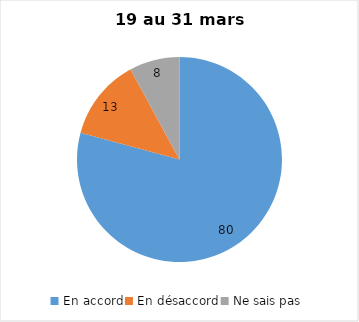
| Category | Series 0 |
|---|---|
| En accord | 80 |
| En désaccord | 13 |
| Ne sais pas | 8 |